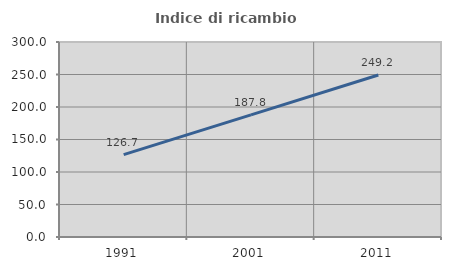
| Category | Indice di ricambio occupazionale  |
|---|---|
| 1991.0 | 126.732 |
| 2001.0 | 187.848 |
| 2011.0 | 249.176 |